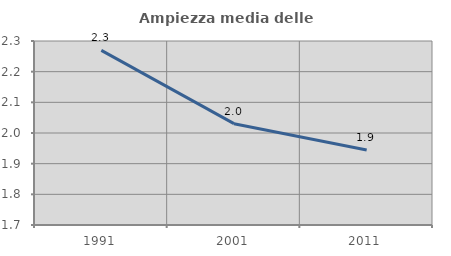
| Category | Ampiezza media delle famiglie |
|---|---|
| 1991.0 | 2.269 |
| 2001.0 | 2.03 |
| 2011.0 | 1.945 |